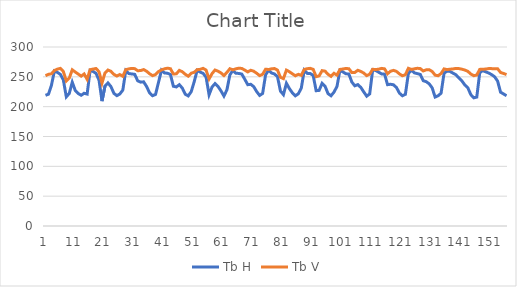
| Category | Tb H | Tb V |
|---|---|---|
| 0 | 219.058 | 252.018 |
| 1 | 220.905 | 254.192 |
| 2 | 235.941 | 255.135 |
| 3 | 259.825 | 260.594 |
| 4 | 257.43 | 262.899 |
| 5 | 254.171 | 264.142 |
| 6 | 244.912 | 259.012 |
| 7 | 216.464 | 243.114 |
| 8 | 222.194 | 247.945 |
| 9 | 241.017 | 261.751 |
| 10 | 227.28 | 258.102 |
| 11 | 222.098 | 254.675 |
| 12 | 219.121 | 251.169 |
| 13 | 222.501 | 254.817 |
| 14 | 221.118 | 245.831 |
| 15 | 260.681 | 261.958 |
| 16 | 258.986 | 263.032 |
| 17 | 255.802 | 263.926 |
| 18 | 244.347 | 258.535 |
| 19 | 209.288 | 239.586 |
| 20 | 234.549 | 256.535 |
| 21 | 239.763 | 261.427 |
| 22 | 233.715 | 259.295 |
| 23 | 222.353 | 254.172 |
| 24 | 218.453 | 251.336 |
| 25 | 221.276 | 253.801 |
| 26 | 227.835 | 250.856 |
| 27 | 260.654 | 262.07 |
| 28 | 255.528 | 263.31 |
| 29 | 254.832 | 264.108 |
| 30 | 254.179 | 263.72 |
| 31 | 243.329 | 260.315 |
| 32 | 241.133 | 260.49 |
| 33 | 241.626 | 262.207 |
| 34 | 233.692 | 259.359 |
| 35 | 223.109 | 255.16 |
| 36 | 218.381 | 252.002 |
| 37 | 220.469 | 253.774 |
| 38 | 240.788 | 258.804 |
| 39 | 261.145 | 261.615 |
| 40 | 256.548 | 263.399 |
| 41 | 256.043 | 264.49 |
| 42 | 254.029 | 263.624 |
| 43 | 234.231 | 254.78 |
| 44 | 233.064 | 255.047 |
| 45 | 236.828 | 260.8 |
| 46 | 231.128 | 258.535 |
| 47 | 220.794 | 254.26 |
| 48 | 218.034 | 251.096 |
| 49 | 225.27 | 256.049 |
| 50 | 241.876 | 257.614 |
| 51 | 260.853 | 262.025 |
| 52 | 257.934 | 262.57 |
| 53 | 255.769 | 264.208 |
| 54 | 249.348 | 261.334 |
| 55 | 219.955 | 246.41 |
| 56 | 232.988 | 255.406 |
| 57 | 238.643 | 261.402 |
| 58 | 233.903 | 259.458 |
| 59 | 226.444 | 256.599 |
| 60 | 217.795 | 252.086 |
| 61 | 228.252 | 257.531 |
| 62 | 253.381 | 263.57 |
| 63 | 260.773 | 261.696 |
| 64 | 256.052 | 263.442 |
| 65 | 255.691 | 264.442 |
| 66 | 254.626 | 264.078 |
| 67 | 246.025 | 261.286 |
| 68 | 236.857 | 258.252 |
| 69 | 237.523 | 261.031 |
| 70 | 233.661 | 259.418 |
| 71 | 225.251 | 256.013 |
| 72 | 218.855 | 252.092 |
| 73 | 222.089 | 254.227 |
| 74 | 253.413 | 262.785 |
| 75 | 260.96 | 262.309 |
| 76 | 256.486 | 263.372 |
| 77 | 254.806 | 263.937 |
| 78 | 250.19 | 261.255 |
| 79 | 226.09 | 249.235 |
| 80 | 220.105 | 246.977 |
| 81 | 239.179 | 261.256 |
| 82 | 230.343 | 258.551 |
| 83 | 223.223 | 255.105 |
| 84 | 218.238 | 251.797 |
| 85 | 221.566 | 254.166 |
| 86 | 230.963 | 252.492 |
| 87 | 261.114 | 262.344 |
| 88 | 255.806 | 263.646 |
| 89 | 255.549 | 264.242 |
| 90 | 252.411 | 262.564 |
| 91 | 226.733 | 250.273 |
| 92 | 227.259 | 251.596 |
| 93 | 239.126 | 260.378 |
| 94 | 234.144 | 259.526 |
| 95 | 221.851 | 254.229 |
| 96 | 218.249 | 250.8 |
| 97 | 224.452 | 255.93 |
| 98 | 233.833 | 252.865 |
| 99 | 261.032 | 262.375 |
| 100 | 258.185 | 263.102 |
| 101 | 255.119 | 264.105 |
| 102 | 254.75 | 263.536 |
| 103 | 241.271 | 257.154 |
| 104 | 234.962 | 257.336 |
| 105 | 236.963 | 260.975 |
| 106 | 232.377 | 259.135 |
| 107 | 224.769 | 256.332 |
| 108 | 217.574 | 252 |
| 109 | 221.37 | 254.49 |
| 110 | 261.495 | 262.65 |
| 111 | 260.657 | 262.168 |
| 112 | 257.807 | 262.812 |
| 113 | 254.881 | 264.179 |
| 114 | 254.507 | 263.391 |
| 115 | 236.88 | 255.101 |
| 116 | 237.569 | 259.367 |
| 117 | 236.624 | 260.821 |
| 118 | 232.133 | 259.113 |
| 119 | 222.718 | 254.867 |
| 120 | 218.234 | 251.796 |
| 121 | 220.683 | 253.611 |
| 122 | 255.336 | 264.297 |
| 123 | 261.366 | 262.43 |
| 124 | 256.667 | 263.421 |
| 125 | 255.413 | 264.329 |
| 126 | 254.052 | 263.862 |
| 127 | 243.565 | 259.866 |
| 128 | 241.886 | 261.748 |
| 129 | 238.326 | 261.991 |
| 130 | 231.55 | 258.992 |
| 131 | 216.116 | 252.903 |
| 132 | 218.311 | 251.823 |
| 133 | 222.482 | 255.538 |
| 134 | 256.015 | 263.253 |
| 135 | 259.595 | 262.177 |
| 136 | 259.056 | 262.785 |
| 137 | 256.167 | 263.224 |
| 138 | 253.477 | 264.12 |
| 139 | 247.971 | 263.83 |
| 140 | 243.144 | 262.843 |
| 141 | 236.307 | 261.336 |
| 142 | 231.568 | 259.221 |
| 143 | 220.103 | 254.702 |
| 144 | 214.853 | 251.95 |
| 145 | 216.081 | 252.972 |
| 146 | 256.935 | 262.496 |
| 147 | 260.378 | 262.699 |
| 148 | 258.448 | 263.048 |
| 149 | 256.369 | 263.849 |
| 150 | 253.75 | 263.753 |
| 151 | 250.081 | 263.395 |
| 152 | 242.965 | 263.595 |
| 153 | 224.24 | 257.315 |
| 154 | 221.347 | 255.609 |
| 155 | 218.287 | 253.849 |